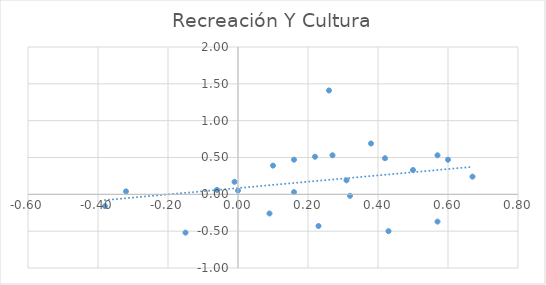
| Category | Recreación Y Cultura |
|---|---|
| 0.38 | 0.69 |
| -0.15 | -0.52 |
| -0.06 | 0.06 |
| 0.32 | -0.02 |
| -0.01 | 0.17 |
| 0.0 | 0.05 |
| -0.38 | -0.16 |
| -0.32 | 0.04 |
| 0.16 | 0.03 |
| 0.57 | -0.37 |
| 0.67 | 0.24 |
| 0.42 | 0.49 |
| 0.26 | 1.41 |
| 0.1 | 0.39 |
| 0.16 | 0.47 |
| 0.23 | -0.43 |
| 0.09 | -0.26 |
| 0.22 | 0.51 |
| 0.27 | 0.53 |
| 0.31 | 0.19 |
| 0.5 | 0.33 |
| 0.43 | -0.5 |
| 0.57 | 0.53 |
| 0.6 | 0.47 |